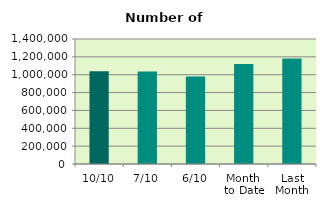
| Category | Series 0 |
|---|---|
| 10/10 | 1039886 |
| 7/10 | 1037322 |
| 6/10 | 980380 |
| Month 
to Date | 1119531.333 |
| Last
Month | 1182612.273 |